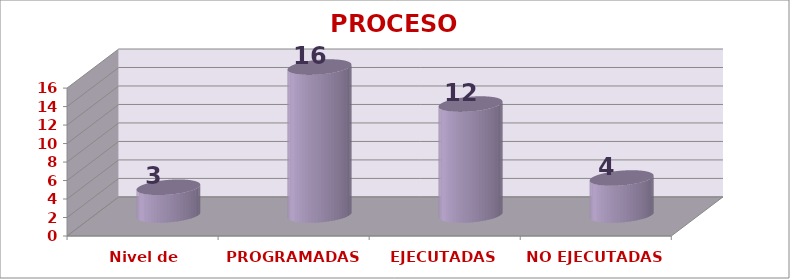
| Category | PROCESO ACCESIBILIDAD |
|---|---|
| Nivel de satisfacción | 3 |
| PROGRAMADAS | 16 |
| EJECUTADAS | 12 |
| NO EJECUTADAS | 4 |